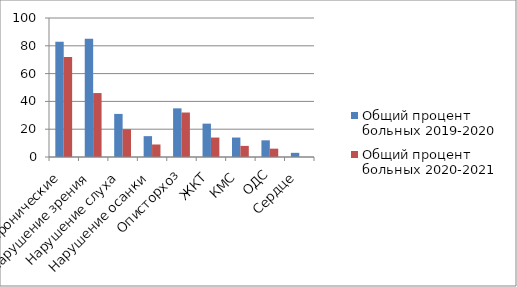
| Category | Общий процент больных 2019-2020 | Общий процент больных 2020-2021 |
|---|---|---|
| Хронические | 83 | 72 |
| Нарушение зрения | 85 | 46 |
| Нарушение слуха | 31 | 20 |
| Нарушение осанки | 15 | 9 |
| Описторхоз | 35 | 32 |
| ЖКТ | 24 | 14 |
| КМС | 14 | 8 |
| ОДС | 12 | 6 |
| Сердце | 3 | 0 |